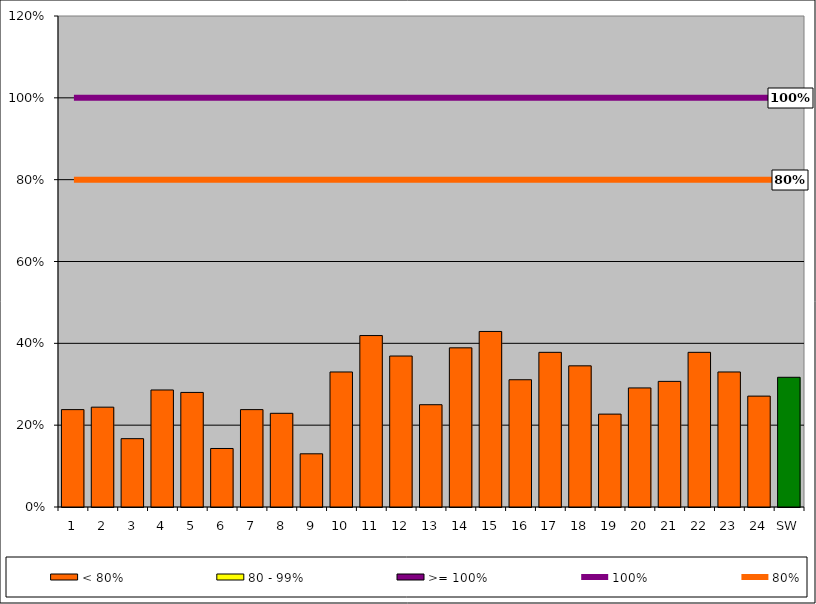
| Category | < 80% | 80 - 99% | >= 100% |
|---|---|---|---|
| 1 | 0.238 | 0 | 0 |
| 2 | 0.244 | 0 | 0 |
| 3 | 0.167 | 0 | 0 |
| 4 | 0.286 | 0 | 0 |
| 5 | 0.28 | 0 | 0 |
| 6 | 0.143 | 0 | 0 |
| 7 | 0.238 | 0 | 0 |
| 8 | 0.229 | 0 | 0 |
| 9 | 0.13 | 0 | 0 |
| 10 | 0.33 | 0 | 0 |
| 11 | 0.419 | 0 | 0 |
| 12 | 0.369 | 0 | 0 |
| 13 | 0.25 | 0 | 0 |
| 14 | 0.389 | 0 | 0 |
| 15 | 0.429 | 0 | 0 |
| 16 | 0.311 | 0 | 0 |
| 17 | 0.378 | 0 | 0 |
| 18 | 0.345 | 0 | 0 |
| 19 | 0.227 | 0 | 0 |
| 20 | 0.291 | 0 | 0 |
| 21 | 0.307 | 0 | 0 |
| 22 | 0.378 | 0 | 0 |
| 23 | 0.33 | 0 | 0 |
| 24 | 0.271 | 0 | 0 |
| SW | 0.317 | 0 | 0 |